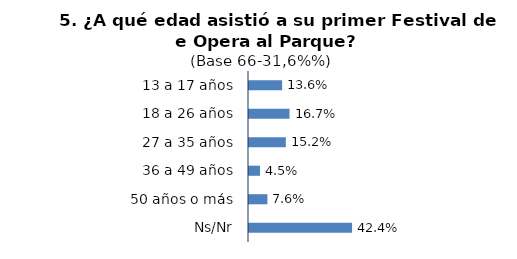
| Category | Series 0 |
|---|---|
| 13 a 17 años | 0.136 |
| 18 a 26 años | 0.167 |
| 27 a 35 años | 0.152 |
| 36 a 49 años | 0.045 |
| 50 años o más | 0.076 |
| Ns/Nr | 0.424 |